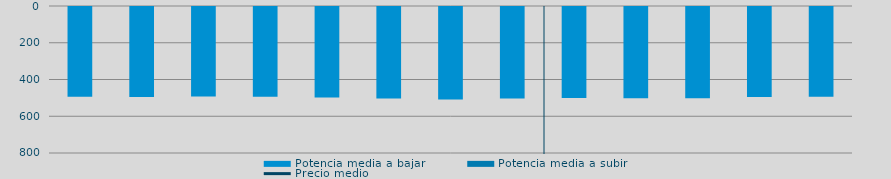
| Category | Potencia media a bajar | Potencia media a subir |
|---|---|---|
| 0 | 488.923 |  |
| 1 | 489.119 |  |
| 2 | 487.546 |  |
| 3 | 488.653 |  |
| 4 | 492.01 |  |
| 5 | 498.529 |  |
| 6 | 503.264 |  |
| 7 | 498.488 |  |
| 8 | 495.172 |  |
| 9 | 496.264 |  |
| 10 | 496.176 |  |
| 11 | 490.249 |  |
| 12 | 488.138 |  |